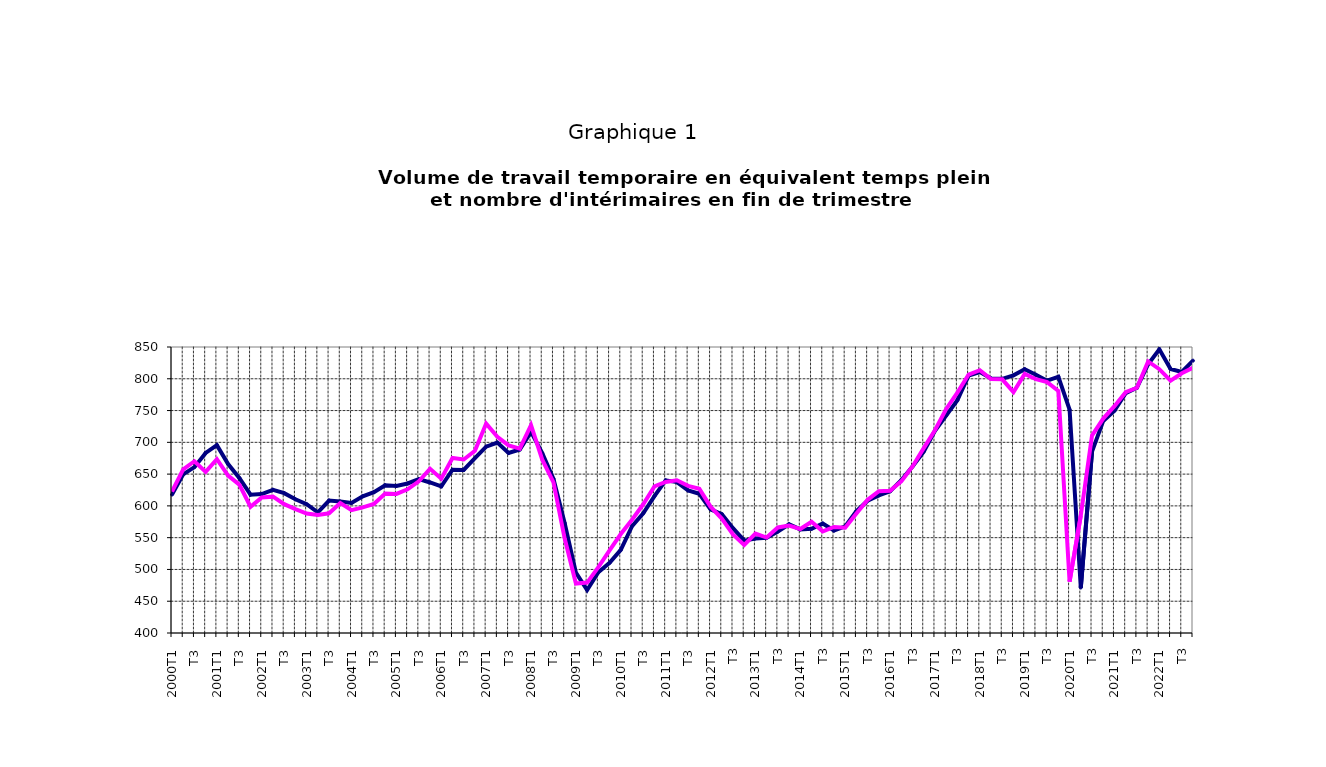
| Category | EETP | int |
|---|---|---|
| 2000T1 | 617.816 | 622.594 |
|      T2 | 649.631 | 657.411 |
|      T3 | 660.998 | 670.235 |
|      T4 | 683.361 | 653.452 |
| 2001T1 | 695.633 | 673.54 |
|      T2 | 665.836 | 647.568 |
|      T3 | 644.024 | 633.511 |
|      T4 | 617.575 | 598.655 |
| 2002T1 | 618.639 | 613.226 |
|      T2 | 625.353 | 614.538 |
|      T3 | 620.029 | 602.771 |
|      T4 | 610.371 | 594.948 |
| 2003T1 | 602.609 | 587.88 |
|      T2 | 589.773 | 585.855 |
|      T3 | 608.423 | 588.311 |
|      T4 | 606.878 | 604.404 |
| 2004T1 | 604.506 | 593.289 |
|      T2 | 615.114 | 597.707 |
|      T3 | 621.482 | 603.032 |
|      T4 | 632.571 | 619.458 |
| 2005T1 | 631.436 | 618.799 |
|      T2 | 635.25 | 626.101 |
|      T3 | 642.027 | 638.721 |
|      T4 | 636.871 | 658.509 |
| 2006T1 | 630.658 | 642.896 |
|      T2 | 656.868 | 675.389 |
|      T3 | 656.601 | 673.041 |
|      T4 | 675.162 | 686.787 |
| 2007T1 | 693.28 | 729.471 |
|      T2 | 699.713 | 708.656 |
|      T3 | 683.39 | 695.265 |
|      T4 | 688.661 | 690.036 |
| 2008T1 | 716.375 | 726.971 |
|      T2 | 682.978 | 672.678 |
|      T3 | 642.435 | 636.835 |
|      T4 | 572.846 | 548.528 |
| 2009T1 | 494.859 | 477.746 |
|      T2 | 467.692 | 479.358 |
|      T3 | 495.606 | 503.51 |
|      T4 | 510.362 | 529.933 |
| 2010T1 | 530.856 | 555.727 |
|      T2 | 567.984 | 578.292 |
|      T3 | 588.345 | 602.513 |
|      T4 | 615.293 | 630.779 |
| 2011T1 | 640.219 | 637.611 |
|      T2 | 637.393 | 640.322 |
|      T3 | 624.313 | 631.494 |
|      T4 | 619.096 | 626.895 |
| 2012T1 | 594.66 | 598.782 |
|      T2 | 587.059 | 579.969 |
| T3 | 564.895 | 554.973 |
| T4 | 545.317 | 538.462 |
| 2013T1 | 548.745 | 556.392 |
| T2 | 549.981 | 550.123 |
| T3 | 559.611 | 566.103 |
| T4 | 571.146 | 569.029 |
| 2014T1 | 562.95 | 563.604 |
| T2 | 563.843 | 574.98 |
| T3 | 572.134 | 559.887 |
| T4 | 561.172 | 566.843 |
| 2015T1 | 567.686 | 565.557 |
| T2 | 591.722 | 587.989 |
| T3 | 608.172 | 609.552 |
| T4 | 616.563 | 623.168 |
| 2016T1 | 622.873 | 623.721 |
| T2 | 640.306 | 638.558 |
| T3 | 661.797 | 662.017 |
| T4 | 685.388 | 690.92 |
| 2017T1 | 717.965 | 719.052 |
| T2 | 742.114 | 752.472 |
| T3 | 766.4 | 778.322 |
| T4 | 804.85 | 806.666 |
| 2018T1 | 810.534 | 813.463 |
| T2 | 800.632 | 799.695 |
| T3 | 799.884 | 799.128 |
| T4 | 805.49 | 779.112 |
| 2019T1 | 815.073 | 807.63 |
| T2 | 806.296 | 799.335 |
| T3 | 797.056 | 794.781 |
| T4 | 803.17 | 780.886 |
| 2020T1 | 751.355 | 480.871 |
| T2 | 471.563 | 584.937 |
| T3 | 685.441 | 710.616 |
| T4 | 733.668 | 737.349 |
| 2021T1 | 749.69 | 756.919 |
| T2 | 777.344 | 778.934 |
| T3 | 785.785 | 785.818 |
| T4 | 822.944 | 827.278 |
| 2022T1 | 846.324 | 815.025 |
| T2 | 815.396 | 796.896 |
| T3 | 810.815 | 808.592 |
| T4 | 828.493 | 817.228 |